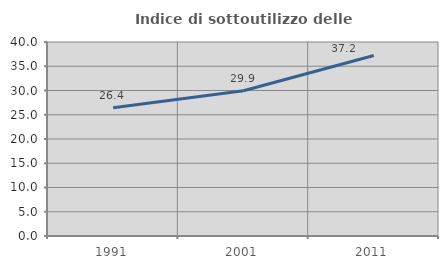
| Category | Indice di sottoutilizzo delle abitazioni  |
|---|---|
| 1991.0 | 26.425 |
| 2001.0 | 29.934 |
| 2011.0 | 37.231 |